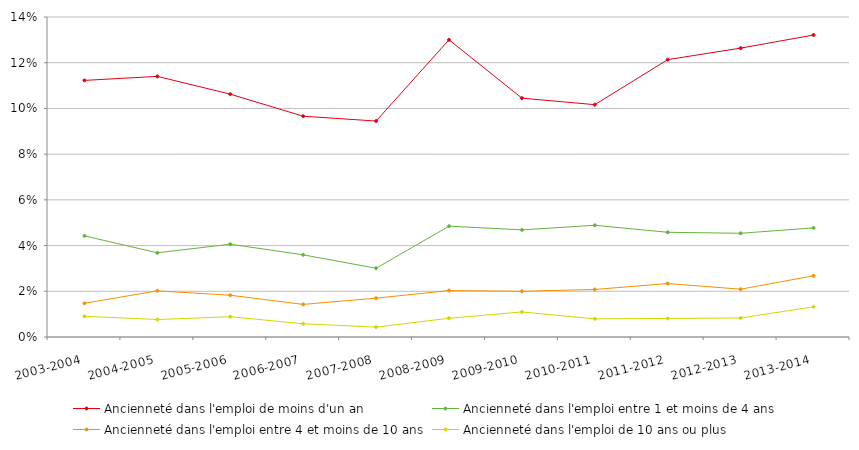
| Category | Ancienneté dans l'emploi de moins d'un an | Ancienneté dans l'emploi entre 1 et moins de 4 ans | Ancienneté dans l'emploi entre 4 et moins de 10 ans | Ancienneté dans l'emploi de 10 ans ou plus |
|---|---|---|---|---|
| 2003-2004 | 0.112 | 0.044 | 0.015 | 0.009 |
| 2004-2005 | 0.114 | 0.037 | 0.02 | 0.008 |
| 2005-2006 | 0.106 | 0.041 | 0.018 | 0.009 |
| 2006-2007 | 0.097 | 0.036 | 0.014 | 0.006 |
| 2007-2008 | 0.094 | 0.03 | 0.017 | 0.004 |
| 2008-2009 | 0.13 | 0.048 | 0.02 | 0.008 |
| 2009-2010 | 0.104 | 0.047 | 0.02 | 0.011 |
| 2010-2011 | 0.102 | 0.049 | 0.021 | 0.008 |
| 2011-2012 | 0.121 | 0.046 | 0.023 | 0.008 |
| 2012-2013 | 0.126 | 0.045 | 0.021 | 0.008 |
| 2013-2014 | 0.132 | 0.048 | 0.027 | 0.013 |